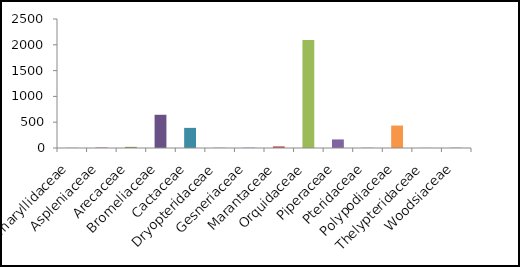
| Category | Quantidade |
|---|---|
| Amaryllidaceae | 3 |
| Aspleniaceae | 8 |
| Arecaceae | 22 |
| Bromeliaceae | 644 |
| Cactaceae | 390 |
| Dryopteridaceae | 5 |
| Gesneriaceae | 6 |
| Marantaceae | 32 |
| Orquidaceae | 2091 |
| Piperaceae | 166 |
| Pteridaceae | 5 |
| Polypodiaceae | 435 |
| Thelypteridaceae | 4 |
| Woodsiaceae | 9 |